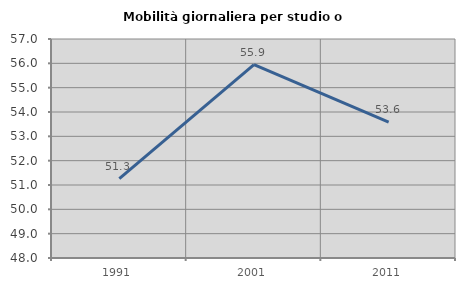
| Category | Mobilità giornaliera per studio o lavoro |
|---|---|
| 1991.0 | 51.264 |
| 2001.0 | 55.949 |
| 2011.0 | 53.581 |